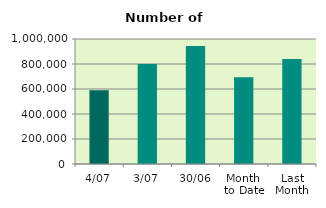
| Category | Series 0 |
|---|---|
| 4/07 | 589920 |
| 3/07 | 800080 |
| 30/06 | 944652 |
| Month 
to Date | 695000 |
| Last
Month | 840506.364 |